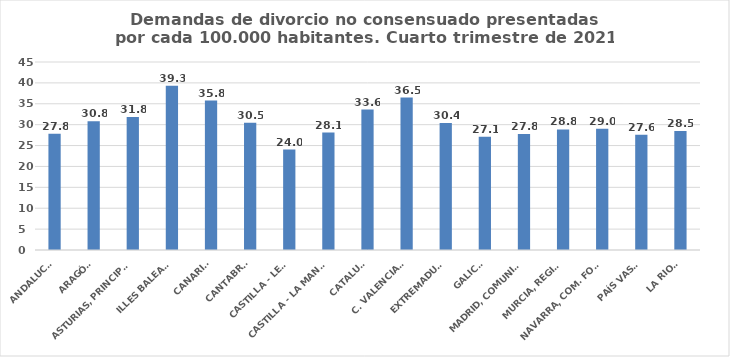
| Category | Series 0 |
|---|---|
| ANDALUCÍA | 27.84 |
| ARAGÓN | 30.839 |
| ASTURIAS, PRINCIPADO | 31.825 |
| ILLES BALEARS | 39.301 |
| CANARIAS | 35.758 |
| CANTABRIA | 30.453 |
| CASTILLA - LEÓN | 24.044 |
| CASTILLA - LA MANCHA | 28.104 |
| CATALUÑA | 33.619 |
| C. VALENCIANA | 36.496 |
| EXTREMADURA | 30.392 |
| GALICIA | 27.081 |
| MADRID, COMUNIDAD | 27.758 |
| MURCIA, REGIÓN | 28.845 |
| NAVARRA, COM. FORAL | 29.023 |
| PAÍS VASCO | 27.597 |
| LA RIOJA | 28.456 |